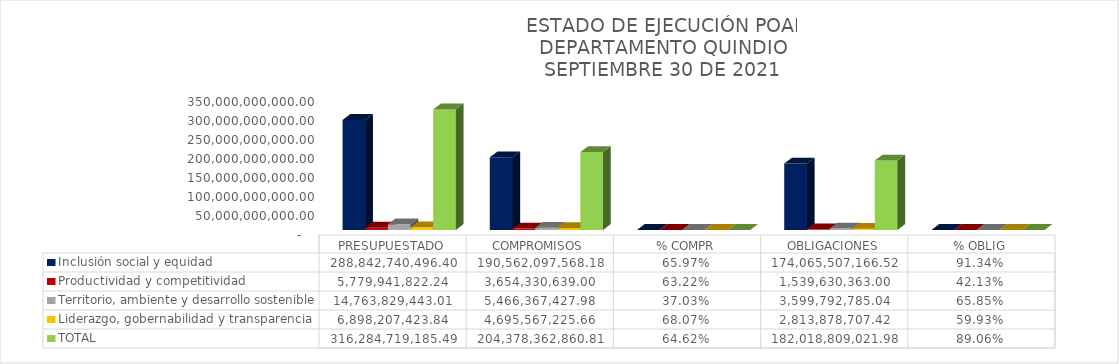
| Category | Inclusión social y equidad | Productividad y competitividad | Territorio, ambiente y desarrollo sostenible | Liderazgo, gobernabilidad y transparencia | TOTAL |
|---|---|---|---|---|---|
| PRESUPUESTADO | 288842740496.4 | 5779941822.24 | 14763829443.01 | 6898207423.84 | 316284719185.49 |
| COMPROMISOS | 190562097568.176 | 3654330639 | 5466367427.976 | 4695567225.66 | 204378362860.812 |
| % COMPR | 0.66 | 0.632 | 0.37 | 0.681 | 0.646 |
| OBLIGACIONES | 174065507166.52 | 1539630363 | 3599792785.036 | 2813878707.42 | 182018809021.976 |
| % OBLIG | 0.913 | 0.421 | 0.659 | 0.599 | 0.891 |